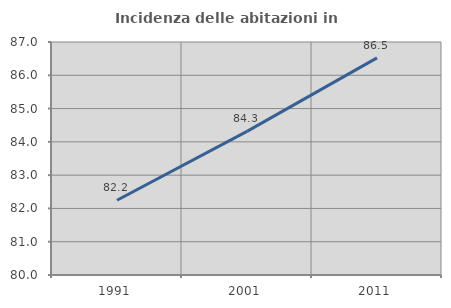
| Category | Incidenza delle abitazioni in proprietà  |
|---|---|
| 1991.0 | 82.246 |
| 2001.0 | 84.314 |
| 2011.0 | 86.522 |